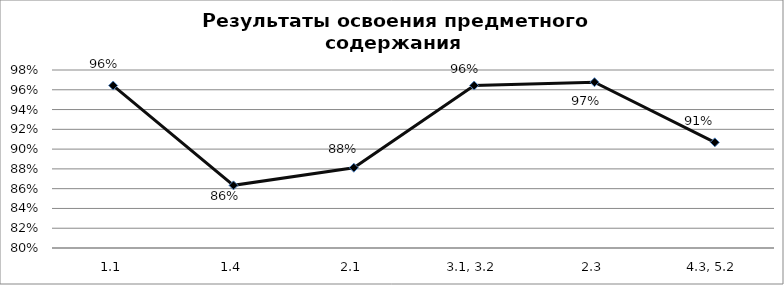
| Category | Series 0 |
|---|---|
| 1.1 | 0.964 |
| 1.4 | 0.863 |
| 2.1 | 0.881 |
| 3.1, 3.2 | 0.964 |
| 2.3 | 0.968 |
| 4.3, 5.2 | 0.907 |